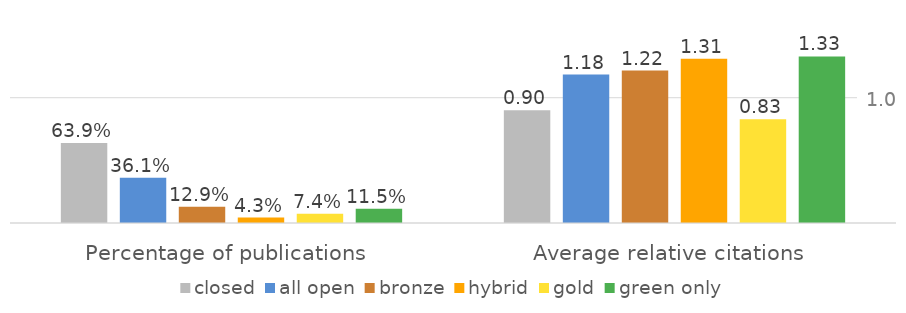
| Category | closed | all open | bronze | hybrid | gold | green only |
|---|---|---|---|---|---|---|
| Percentage of publications | 0.639 | 0.361 | 0.129 | 0.043 | 0.074 | 0.115 |
| Average relative citations | 0.9 | 1.185 | 1.217 | 1.31 | 0.828 | 1.33 |